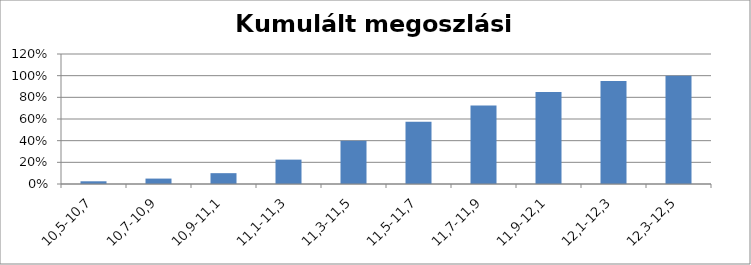
| Category | Series 0 |
|---|---|
| 10,5-10,7 | 0.025 |
| 10,7-10,9 | 0.05 |
| 10,9-11,1 | 0.1 |
| 11,1-11,3 | 0.225 |
| 11,3-11,5 | 0.4 |
| 11,5-11,7 | 0.575 |
| 11,7-11,9 | 0.725 |
| 11,9-12,1 | 0.85 |
| 12,1-12,3 | 0.95 |
| 12,3-12,5 | 1 |